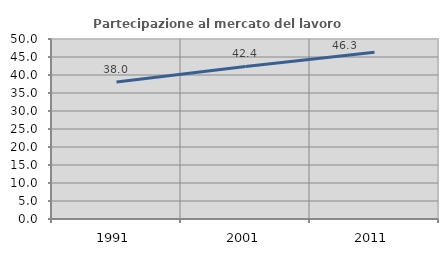
| Category | Partecipazione al mercato del lavoro  femminile |
|---|---|
| 1991.0 | 38.042 |
| 2001.0 | 42.387 |
| 2011.0 | 46.303 |